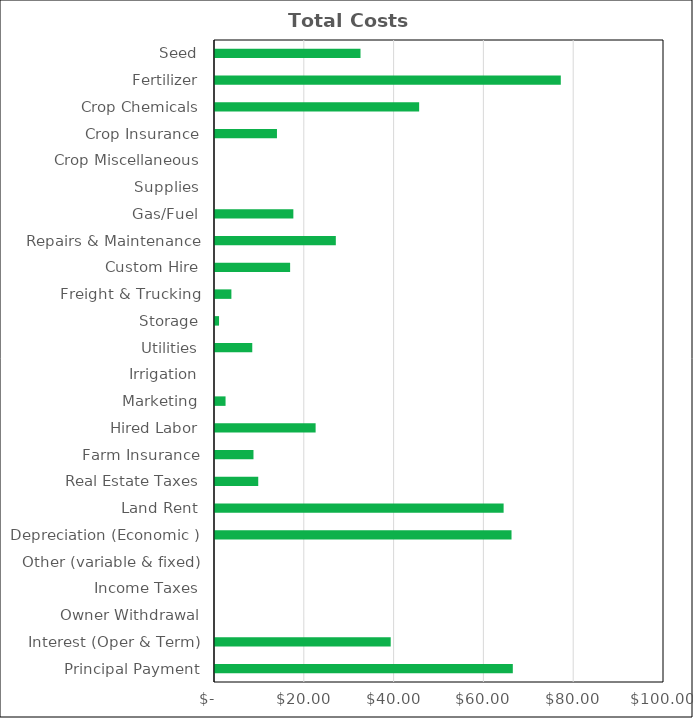
| Category | Wheat |
|---|---|
| Seed | 32.405 |
| Fertilizer | 77.015 |
| Crop Chemicals | 45.469 |
| Crop Insurance | 13.8 |
| Crop Miscellaneous | 0 |
| Supplies | 0 |
| Gas/Fuel | 17.45 |
| Repairs & Maintenance | 26.91 |
| Custom Hire | 16.73 |
| Freight & Trucking | 3.65 |
| Storage | 0.9 |
| Utilities | 8.3 |
| Irrigation | 0 |
| Marketing | 2.35 |
| Hired Labor | 22.41 |
| Farm Insurance | 8.57 |
| Real Estate Taxes | 9.63 |
| Land Rent | 64.28 |
| Depreciation (Economic ) | 66.04 |
| Other (variable & fixed) | 0 |
| Income Taxes | 0 |
| Owner Withdrawal | 0 |
| Interest (Oper & Term) | 39.133 |
| Principal Payment | 66.328 |